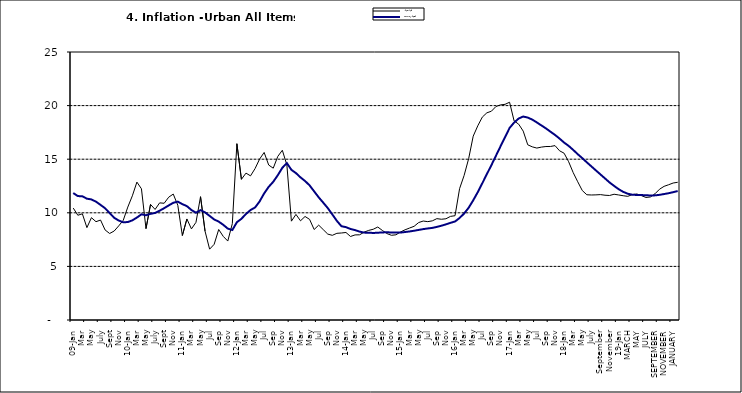
| Category | Year-on Rate | 12-Month Average |
|---|---|---|
| 09-Jan | 10.439 | 11.844 |
| Feb | 9.772 | 11.562 |
| Mar | 9.907 | 11.538 |
| Apr | 8.618 | 11.319 |
| May | 9.547 | 11.246 |
| June | 9.17 | 11.039 |
| July | 9.325 | 10.738 |
| Aug | 8.401 | 10.424 |
| Sept | 8.07 | 9.973 |
| Oct | 8.3 | 9.535 |
| Nov | 8.781 | 9.278 |
| Dec | 9.298 | 9.117 |
| 10-Jan | 10.534 | 9.136 |
| Feb | 11.584 | 9.297 |
| Mar | 12.864 | 9.555 |
| Apr | 12.24 | 9.859 |
| May | 8.524 | 9.769 |
| June | 10.781 | 9.904 |
| July | 10.313 | 9.987 |
| Aug | 10.924 | 10.197 |
| Sept | 10.891 | 10.43 |
| Oct | 11.457 | 10.689 |
| Nov | 11.748 | 10.932 |
| Dec | 10.699 | 11.042 |
| 11-Jan | 7.878 | 10.806 |
| Feb | 9.426 | 10.623 |
| Mar | 8.498 | 10.26 |
| Apr | 9.11 | 10.005 |
| May | 11.5 | 10.249 |
| Jun | 8.278 | 10.034 |
| Jul | 6.608 | 9.711 |
| Aug | 7.061 | 9.38 |
| Sep | 8.443 | 9.178 |
| Oct | 7.802 | 8.88 |
| Nov | 7.365 | 8.525 |
| Dec | 8.993 | 8.395 |
| 12-Jan | 16.445 | 9.119 |
| Feb | 13.123 | 9.443 |
| Mar | 13.701 | 9.889 |
| Apr | 13.447 | 10.259 |
| May | 14.127 | 10.496 |
| Jun | 15.012 | 11.062 |
| Jul | 15.63 | 11.81 |
| Aug | 14.456 | 12.422 |
| Sep | 14.162 | 12.893 |
| Oct | 15.26 | 13.506 |
| Nov | 15.836 | 14.199 |
| Dec | 14.459 | 14.637 |
| 13-Jan | 9.22 | 14.006 |
| Feb | 9.85 | 13.703 |
| Mar | 9.253 | 13.302 |
| Apr | 9.657 | 12.966 |
| May | 9.385 | 12.557 |
| Jun | 8.441 | 11.999 |
| Jul | 8.849 | 11.443 |
| Aug | 8.431 | 10.946 |
| Sep | 8.013 | 10.44 |
| Oct | 7.9 | 9.849 |
| Nov | 8.086 | 9.245 |
| Dec | 8.117 | 8.75 |
| 14-Jan | 8.164 | 8.662 |
| Feb | 7.791 | 8.493 |
| Mar | 7.937 | 8.384 |
| Apr | 7.947 | 8.246 |
| May | 8.195 | 8.151 |
| Jun | 8.358 | 8.146 |
| Jul | 8.464 | 8.118 |
| Aug | 8.673 | 8.141 |
| Sep | 8.357 | 8.17 |
| Oct | 8.064 | 8.182 |
| Nov | 7.902 | 8.165 |
| Dec | 7.948 | 8.151 |
| 15-Jan | 8.211 | 8.155 |
| Feb | 8.412 | 8.206 |
| Mar | 8.579 | 8.26 |
| Apr | 8.742 | 8.326 |
| May | 9.092 | 8.403 |
| Jun | 9.232 | 8.478 |
| Jul | 9.177 | 8.54 |
| Aug | 9.25 | 8.591 |
| Sep | 9.455 | 8.684 |
| Oct | 9.398 | 8.795 |
| Nov | 9.442 | 8.922 |
| Dec | 9.665 | 9.064 |
| 16-Jan | 9.728 | 9.19 |
| Feb | 12.254 | 9.516 |
| Mar | 13.485 | 9.935 |
| Apr | 15.052 | 10.474 |
| May | 17.148 | 11.165 |
| Jun | 18.111 | 11.925 |
| Jul | 18.927 | 12.754 |
| Aug | 19.325 | 13.605 |
| Sep | 19.476 | 14.444 |
| Oct | 19.914 | 15.318 |
| Nov | 20.067 | 16.193 |
| Dec | 20.118 | 17.05 |
| 17-Jan | 20.315 | 17.914 |
| Feb | 18.569 | 18.418 |
| Mar | 18.27 | 18.794 |
| Apr | 17.621 | 18.982 |
| May | 16.343 | 18.883 |
| Jun | 16.153 | 18.692 |
| Jul | 16.038 | 18.43 |
| Aug | 16.128 | 18.151 |
| Sep | 16.183 | 17.872 |
| Oct | 16.187 | 17.567 |
| Nov | 16.267 | 17.264 |
| Dec | 15.785 | 16.921 |
| 18-Jan | 15.559 | 16.55 |
| Feb | 14.763 | 16.241 |
| Mar | 13.748 | 15.866 |
| Apr | 12.893 | 15.468 |
| May | 12.077 | 15.096 |
| June | 11.683 | 14.706 |
| July | 11.661 | 14.329 |
| August | 11.673 | 13.951 |
| September | 11.697 | 13.578 |
| October | 11.64 | 13.206 |
| November | 11.615 | 12.831 |
| December | 11.731 | 12.509 |
| 19-Jan | 11.664 | 12.203 |
| February | 11.592 | 11.954 |
| MARCH | 11.535 | 11.78 |
| APRIL | 11.696 | 11.686 |
| MAY | 11.756 | 11.662 |
| JUNE | 11.605 | 11.655 |
| JULY | 11.432 | 11.635 |
| AUGUST | 11.479 | 11.618 |
| SEPTEMBER | 11.776 | 11.626 |
| OCTOBER | 12.202 | 11.676 |
| NOVEMBER | 12.469 | 11.75 |
| DECEMBER | 12.617 | 11.827 |
| JANUARY | 12.779 | 11.923 |
| FEBRUARY | 12.847 | 12.03 |